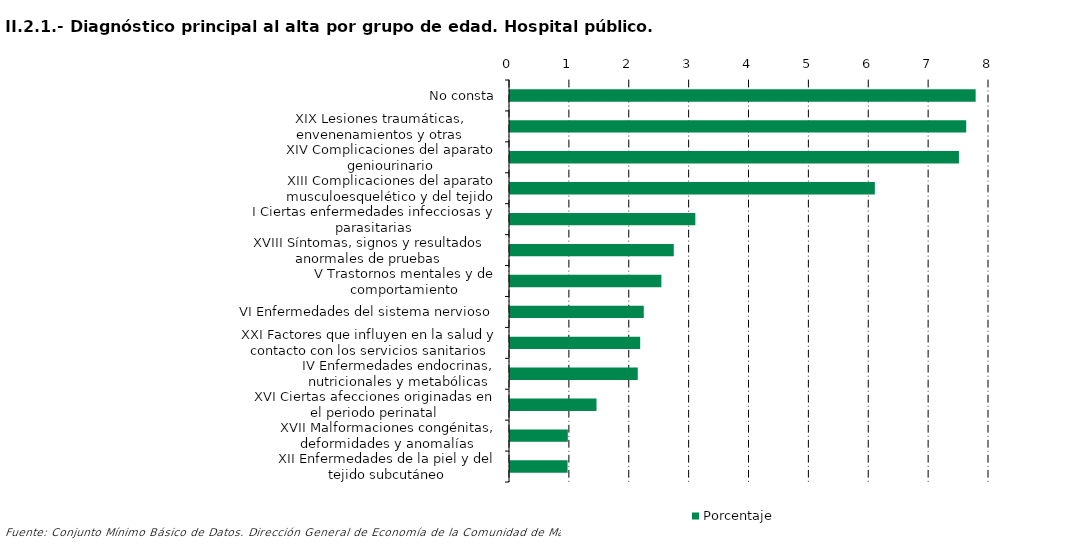
| Category | Porcentaje |
|---|---|
| No consta | 7.777 |
| XIX Lesiones traumáticas, envenenamientos y otras consecuencias de causas externas | 7.619 |
| XIV Complicaciones del aparato geniourinario | 7.498 |
| XIII Complicaciones del aparato musculoesquelético y del tejido conectivo | 6.094 |
| I Ciertas enfermedades infecciosas y parasitarias | 3.095 |
| XVIII Síntomas, signos y resultados anormales de pruebas complementarias, no clasificados bajo otro concepto | 2.735 |
| V Trastornos mentales y de comportamiento | 2.528 |
| VI Enfermedades del sistema nervioso | 2.235 |
| XXI Factores que influyen en la salud y contacto con los servicios sanitarios | 2.174 |
| IV Enfermedades endocrinas, nutricionales y metabólicas | 2.134 |
| XVI Ciertas afecciones originadas en el periodo perinatal | 1.445 |
| XVII Malformaciones congénitas, deformidades y anomalías cromosómicas | 0.966 |
| XII Enfermedades de la piel y del tejido subcutáneo | 0.962 |